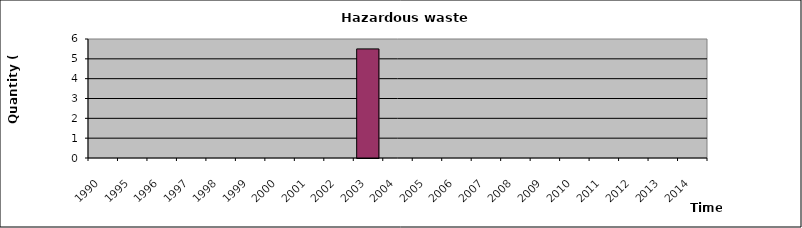
| Category | Series 1 |
|---|---|
| 1990.0 | 0 |
| 1995.0 | 0 |
| 1996.0 | 0 |
| 1997.0 | 0 |
| 1998.0 | 0 |
| 1999.0 | 0 |
| 2000.0 | 0 |
| 2001.0 | 0 |
| 2002.0 | 0 |
| 2003.0 | 5.5 |
| 2004.0 | 0 |
| 2005.0 | 0 |
| 2006.0 | 0 |
| 2007.0 | 0 |
| 2008.0 | 0 |
| 2009.0 | 0 |
| 2010.0 | 0 |
| 2011.0 | 0 |
| 2012.0 | 0 |
| 2013.0 | 0 |
| 2014.0 | 0 |